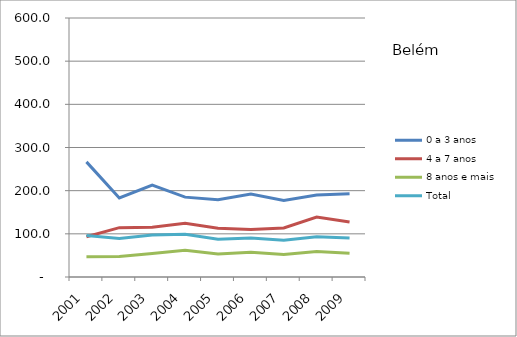
| Category | 0 a 3 anos | 4 a 7 anos | 8 anos e mais | Total |
|---|---|---|---|---|
| 2001.0 | 266.7 | 93.1 | 47.2 | 96 |
| 2002.0 | 183.2 | 114.3 | 47.3 | 89.2 |
| 2003.0 | 212.7 | 115.2 | 54.2 | 97.5 |
| 2004.0 | 185 | 124.3 | 61.7 | 99.2 |
| 2005.0 | 178.9 | 113.2 | 53.1 | 87.4 |
| 2006.0 | 192.3 | 109.8 | 57.6 | 90.3 |
| 2007.0 | 177.1 | 113.7 | 52.2 | 84.9 |
| 2008.0 | 190.1 | 138.9 | 59.3 | 93.5 |
| 2009.0 | 192.9 | 127.2 | 55.3 | 90.6 |